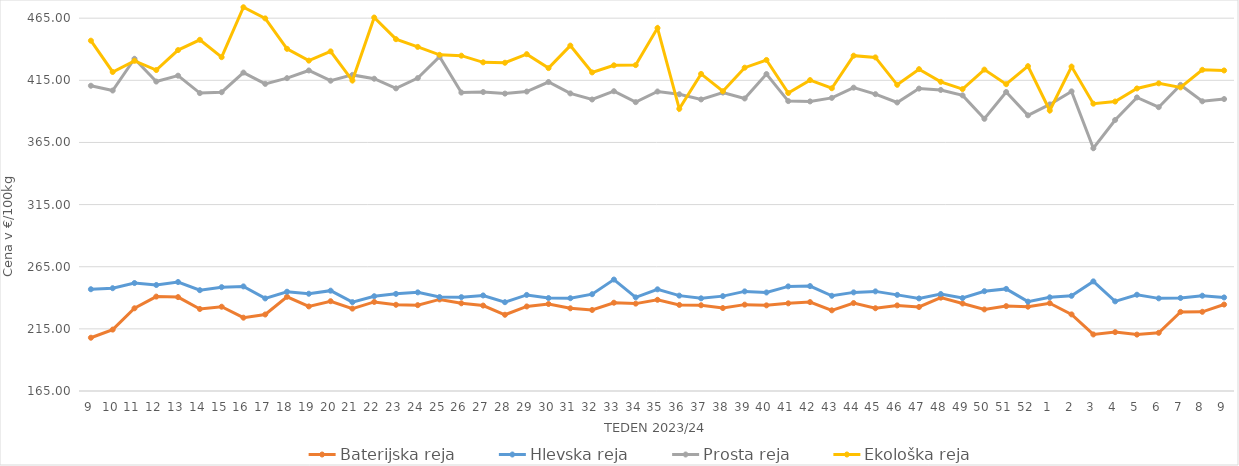
| Category | Baterijska reja | Hlevska reja | Prosta reja | Ekološka reja |
|---|---|---|---|---|
| 9.0 | 207.87 | 246.89 | 410.64 | 446.9 |
| 10.0 | 214.42 | 247.73 | 406.8 | 421.72 |
| 11.0 | 231.56 | 251.88 | 432.34 | 430.69 |
| 12.0 | 240.97 | 250.3 | 414 | 423.28 |
| 13.0 | 240.55 | 252.7 | 418.74 | 439.31 |
| 14.0 | 230.99 | 246.12 | 404.72 | 447.59 |
| 15.0 | 232.82 | 248.56 | 405.42 | 433.62 |
| 16.0 | 224 | 249.17 | 421.22 | 473.79 |
| 17.0 | 226.57 | 239.5 | 412.13 | 464.83 |
| 18.0 | 240.83 | 244.89 | 416.74 | 440.35 |
| 19.0 | 233.05 | 243.26 | 422.93 | 430.86 |
| 20.0 | 237.25 | 245.73 | 414.68 | 438.28 |
| 21.0 | 231.3 | 236.5 | 419.36 | 414.83 |
| 22.0 | 236.67 | 241.27 | 416.27 | 465.52 |
| 23.0 | 234.39 | 243.16 | 408.53 | 448.1 |
| 24.0 | 234.08 | 244.37 | 416.78 | 441.9 |
| 25.0 | 238.69 | 240.6 | 434.05 | 435.52 |
| 26.0 | 235.57 | 240.51 | 405.15 | 434.83 |
| 27.0 | 233.75 | 241.89 | 405.58 | 429.48 |
| 28.0 | 226.35 | 236.46 | 404.32 | 429.14 |
| 29.0 | 233.03 | 242.31 | 405.96 | 436.04 |
| 30.0 | 235 | 239.8 | 413.63 | 424.83 |
| 31.0 | 231.55 | 239.67 | 404.46 | 442.93 |
| 32.0 | 230.2 | 242.89 | 399.57 | 421.38 |
| 33.0 | 236.04 | 254.68 | 406.23 | 427.07 |
| 34.0 | 235.32 | 240.35 | 397.45 | 427.24 |
| 35.0 | 238.39 | 246.82 | 406 | 457.07 |
| 36.0 | 234.27 | 241.75 | 403.79 | 392.07 |
| 37.0 | 234 | 239.58 | 399.61 | 420.17 |
| 38.0 | 231.74 | 241.34 | 405.14 | 406.21 |
| 39.0 | 234.5 | 245.15 | 400.39 | 425.17 |
| 40.0 | 233.92 | 244.29 | 420.04 | 431.38 |
| 41.0 | 235.54 | 249.18 | 398.28 | 404.83 |
| 42.0 | 236.54 | 249.42 | 398.03 | 415.17 |
| 43.0 | 229.92 | 241.62 | 400.86 | 408.62 |
| 44.0 | 235.77 | 244.36 | 409.1 | 434.83 |
| 45.0 | 231.6 | 245.16 | 403.86 | 433.45 |
| 46.0 | 233.89 | 242.36 | 397.17 | 411.38 |
| 47.0 | 232.62 | 239.48 | 408.34 | 423.97 |
| 48.0 | 240.11 | 243.04 | 407.25 | 413.79 |
| 49.0 | 235.41 | 239.81 | 402.87 | 407.93 |
| 50.0 | 230.65 | 245.3 | 384.02 | 423.62 |
| 51.0 | 233.3 | 247.16 | 405.6 | 411.9 |
| 52.0 | 232.85 | 236.91 | 386.82 | 426.38 |
| 1.0 | 235.66 | 240.38 | 395.59 | 390.69 |
| 2.0 | 226.65 | 241.59 | 406.11 | 426.03 |
| 3.0 | 210.5 | 253.21 | 360.35 | 396.21 |
| 4.0 | 212.37 | 237.14 | 383.09 | 397.93 |
| 5.0 | 210.38 | 242.47 | 401.23 | 408.45 |
| 6.0 | 211.82 | 239.54 | 393.39 | 412.59 |
| 7.0 | 228.66 | 239.86 | 411.29 | 409.31 |
| 8.0 | 228.73 | 241.68 | 398.12 | 423.45 |
| 9.0 | 234.57 | 240.29 | 399.93 | 422.93 |